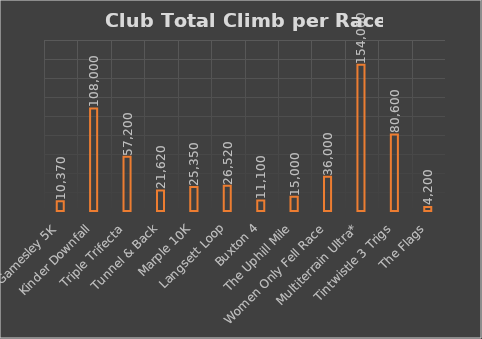
| Category | Series 0 |
|---|---|
| Gamesley 5K | 10370 |
| Kinder Downfall | 108000 |
| Triple Trifecta | 57200 |
| Tunnel & Back | 21620 |
| Marple 10K | 25350 |
| Langsett Loop | 26520 |
| Buxton 4 | 11100 |
| The Uphill Mile | 15000 |
| Women Only Fell Race | 36000 |
| Multiterrain Ultra* | 154000 |
| Tintwistle 3 Trigs | 80600 |
| The Flags | 4200 |